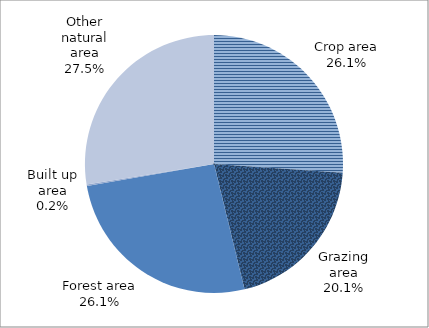
| Category | 1970 |
|---|---|
| Crop area | 0.261 |
| Grazing area | 0.201 |
| Forest area | 0.261 |
| Built up area | 0.002 |
| Other natural area | 0.275 |